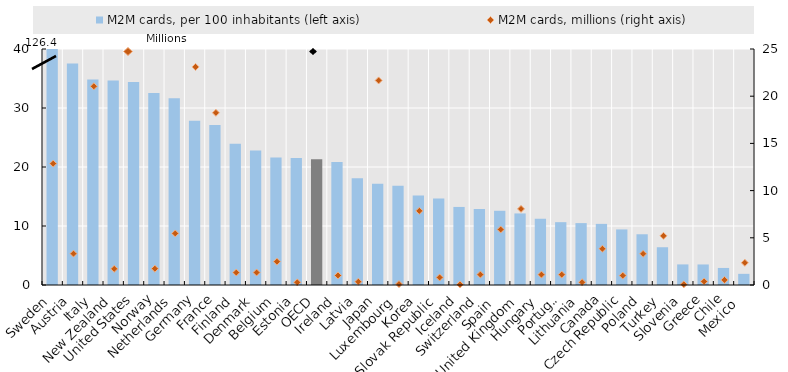
| Category | M2M cards, per 100 inhabitants (left axis) |
|---|---|
| Sweden | 126.35 |
| Austria | 37.56 |
| Italy | 34.83 |
| New Zealand | 34.66 |
| United States | 34.39 |
| Norway | 32.54 |
| Netherlands | 31.66 |
| Germany | 27.86 |
| France | 27.11 |
| Finland | 23.93 |
| Denmark | 22.78 |
| Belgium | 21.63 |
| Estonia | 21.51 |
| OECD | 21.32 |
| Ireland | 20.83 |
| Latvia | 18.1 |
| Japan | 17.14 |
| Luxembourg | 16.82 |
| Korea | 15.19 |
| Slovak Republic | 14.65 |
| Iceland | 13.23 |
| Switzerland | 12.9 |
| Spain  | 12.58 |
| United Kingdom | 12.13 |
| Hungary | 11.21 |
| Portugal | 10.65 |
| Lithuania | 10.49 |
| Canada | 10.36 |
| Czech Republic | 9.42 |
| Poland | 8.6 |
| Turkey | 6.4 |
| Slovenia | 3.49 |
| Greece | 3.48 |
| Chile | 2.89 |
| Mexico  | 1.89 |